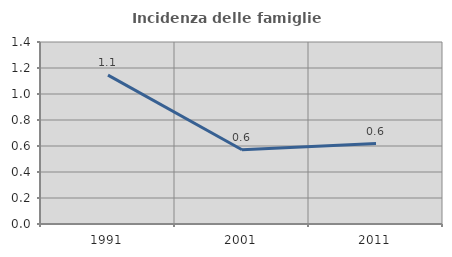
| Category | Incidenza delle famiglie numerose |
|---|---|
| 1991.0 | 1.145 |
| 2001.0 | 0.572 |
| 2011.0 | 0.619 |